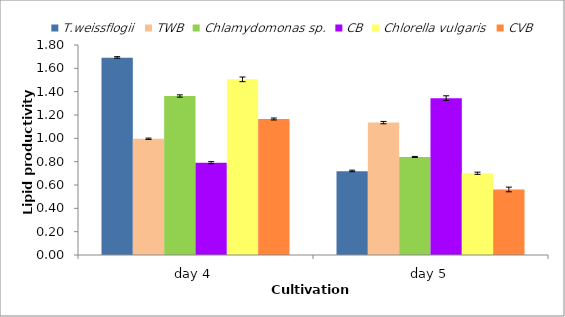
| Category | T.weissflogii | TWB | Chlamydomonas sp. | CB | Chlorella vulgaris | CVB |
|---|---|---|---|---|---|---|
| day 4 | 1.69 | 0.996 | 1.363 | 0.791 | 1.506 | 1.166 |
| day 5 | 0.717 | 1.135 | 0.84 | 1.345 | 0.701 | 0.562 |